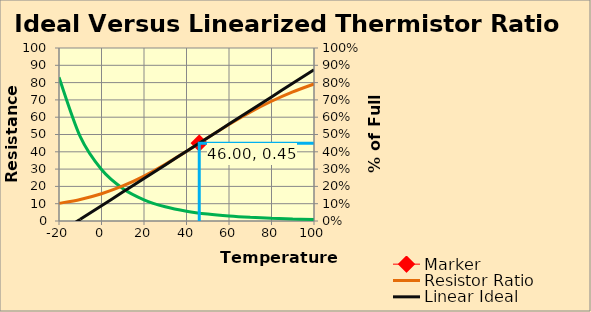
| Category | Marker |
|---|---|
| 46.0 | 0.45 |